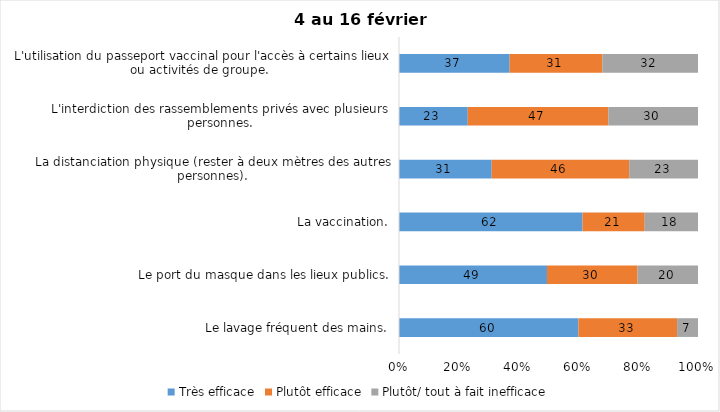
| Category | Très efficace | Plutôt efficace | Plutôt/ tout à fait inefficace |
|---|---|---|---|
| Le lavage fréquent des mains. | 60 | 33 | 7 |
| Le port du masque dans les lieux publics. | 49 | 30 | 20 |
| La vaccination. | 62 | 21 | 18 |
| La distanciation physique (rester à deux mètres des autres personnes). | 31 | 46 | 23 |
| L'interdiction des rassemblements privés avec plusieurs personnes. | 23 | 47 | 30 |
| L'utilisation du passeport vaccinal pour l'accès à certains lieux ou activités de groupe.  | 37 | 31 | 32 |